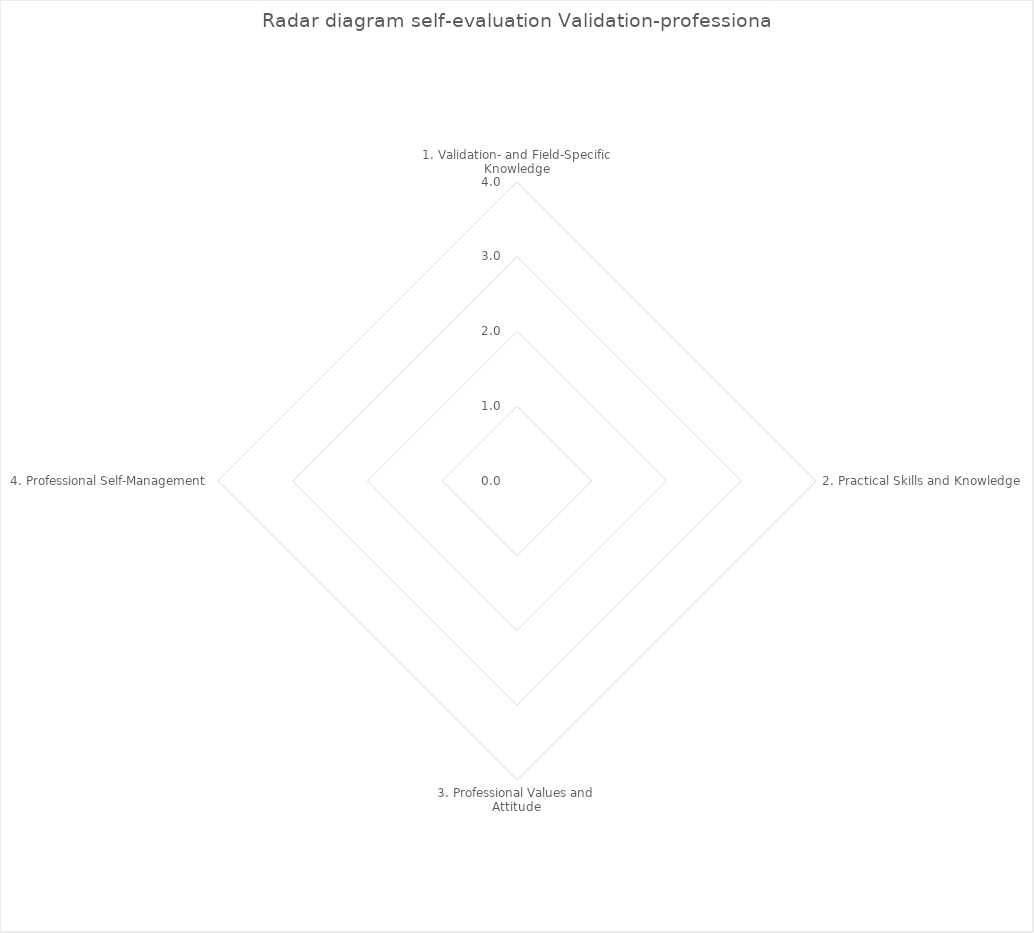
| Category | Series 0 |
|---|---|
| 1. Validation- and Field-Specific Knowledge | 0 |
| 2. Practical Skills and Knowledge | 0 |
| 3. Professional Values and Attitude | 0 |
| 4. Professional Self-Management | 0 |